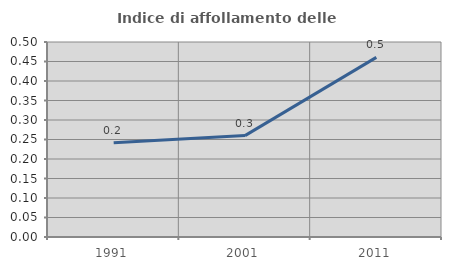
| Category | Indice di affollamento delle abitazioni  |
|---|---|
| 1991.0 | 0.242 |
| 2001.0 | 0.26 |
| 2011.0 | 0.461 |